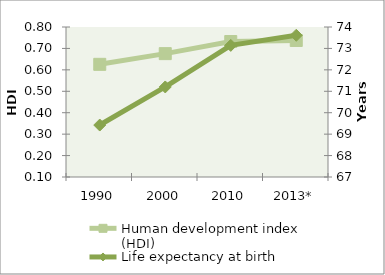
| Category | Human development index (HDI) |
|---|---|
| 1990 | 0.626 |
| 2000 | 0.676 |
| 2010 | 0.732 |
| 2013* | 0.737 |